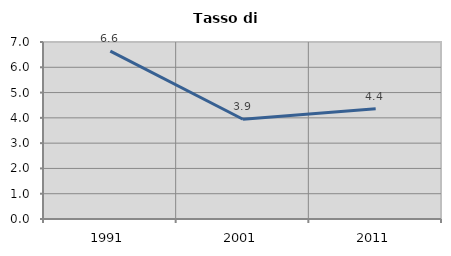
| Category | Tasso di disoccupazione   |
|---|---|
| 1991.0 | 6.64 |
| 2001.0 | 3.945 |
| 2011.0 | 4.356 |